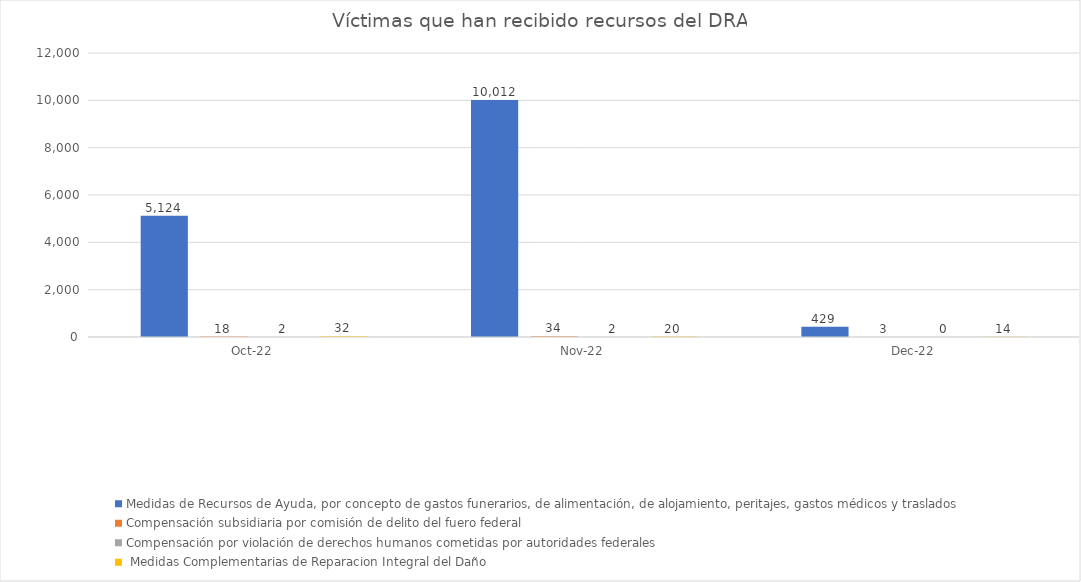
| Category | Medidas de Recursos de Ayuda, por concepto de gastos funerarios, de alimentación, de alojamiento, peritajes, gastos médicos y traslados | Compensación subsidiaria por comisión de delito del fuero federal | Compensación por violación de derechos humanos cometidas por autoridades federales |  Medidas Complementarias de Reparacion Integral del Daño |
|---|---|---|---|---|
| 2022-10-01 | 5124 | 18 | 2 | 32 |
| 2022-11-01 | 10012 | 34 | 2 | 20 |
| 2022-12-01 | 429 | 3 | 0 | 14 |